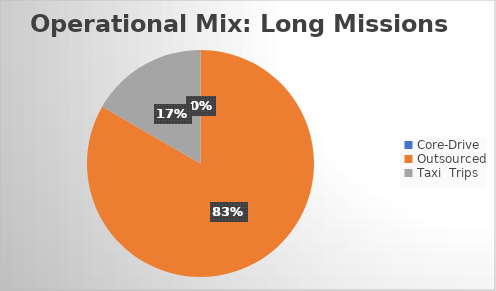
| Category | Series 0 |
|---|---|
| Core-Drive | 0 |
| Outsourced | 5 |
| Taxi  Trips | 1 |